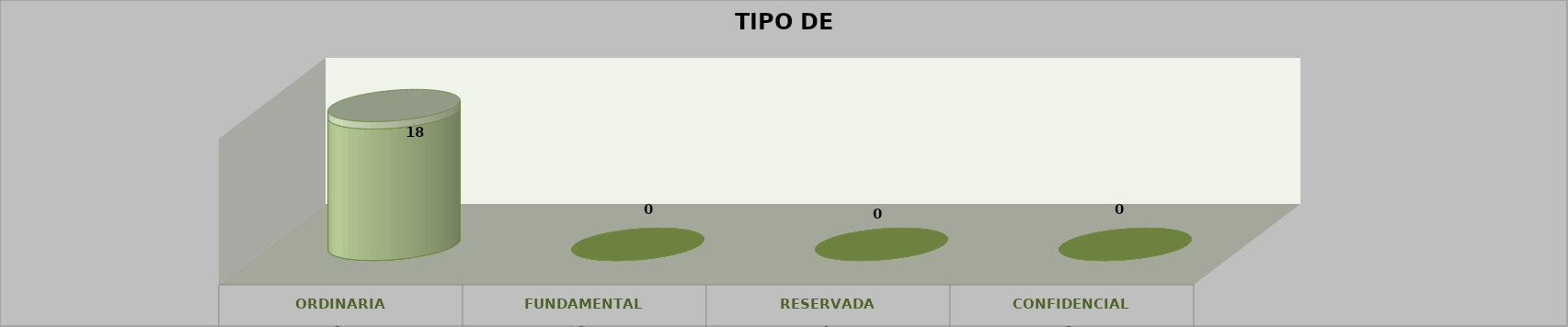
| Category | Series 0 | Series 2 | Series 1 | Series 3 | Series 4 |
|---|---|---|---|---|---|
| 0 |  |  |  | 18 | 1 |
| 1 |  |  |  | 0 | 0 |
| 2 |  |  |  | 0 | 0 |
| 3 |  |  |  | 0 | 0 |